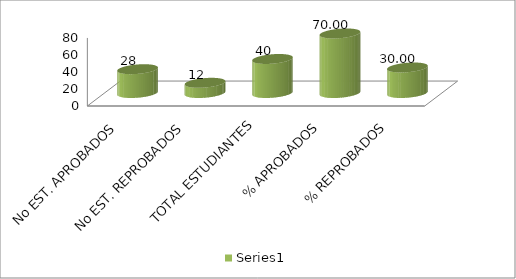
| Category | Series 0 |
|---|---|
| No EST. APROBADOS | 28 |
| No EST. REPROBADOS | 12 |
| TOTAL ESTUDIANTES | 40 |
| % APROBADOS | 70 |
| % REPROBADOS | 30 |